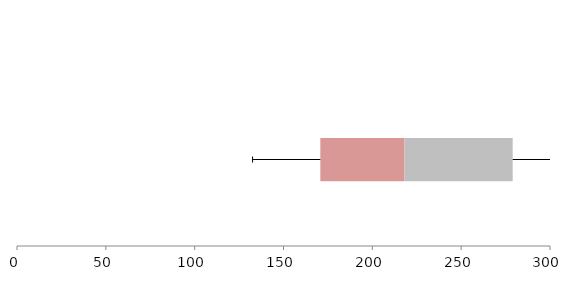
| Category | Series 1 | Series 2 | Series 3 |
|---|---|---|---|
| 0 | 170.73 | 47.377 | 60.888 |